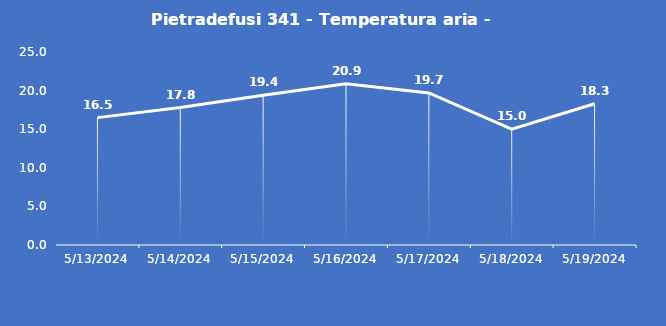
| Category | Pietradefusi 341 - Temperatura aria - Grezzo (°C) |
|---|---|
| 5/13/24 | 16.5 |
| 5/14/24 | 17.8 |
| 5/15/24 | 19.4 |
| 5/16/24 | 20.9 |
| 5/17/24 | 19.7 |
| 5/18/24 | 15 |
| 5/19/24 | 18.3 |